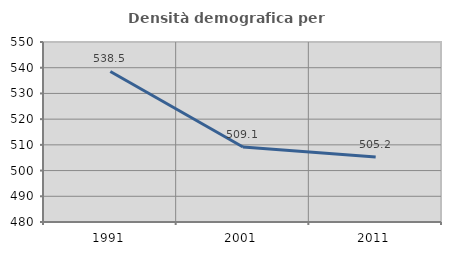
| Category | Densità demografica |
|---|---|
| 1991.0 | 538.529 |
| 2001.0 | 509.146 |
| 2011.0 | 505.244 |